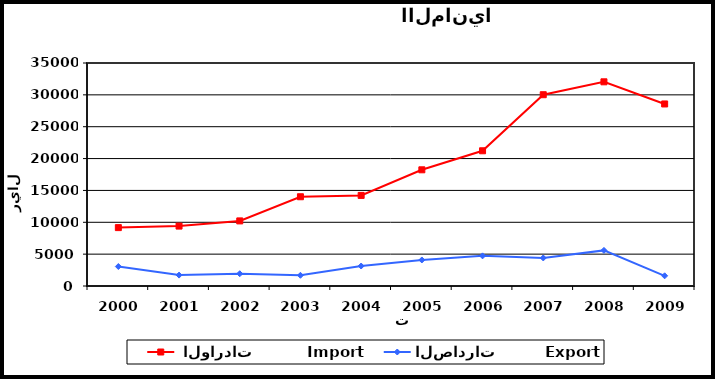
| Category |  الواردات           Import | الصادرات          Export |
|---|---|---|
| 2000.0 | 9164 | 3056 |
| 2001.0 | 9403 | 1714 |
| 2002.0 | 10217 | 1924 |
| 2003.0 | 14009 | 1682 |
| 2004.0 | 14217 | 3135 |
| 2005.0 | 18238 | 4086 |
| 2006.0 | 21223 | 4729 |
| 2007.0 | 30022 | 4401 |
| 2008.0 | 32047 | 5588 |
| 2009.0 | 28572 | 1598 |